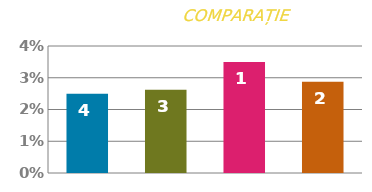
| Category | RATĂ |
|---|---|
| 0 | 0.025 |
| 1 | 0.026 |
| 2 | 0.035 |
| 3 | 0.029 |